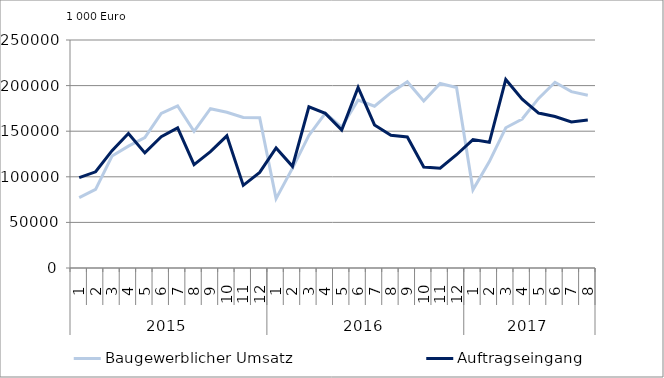
| Category | Baugewerblicher Umsatz | Auftragseingang |
|---|---|---|
| 0 | 77137.228 | 99023.008 |
| 1 | 86257.027 | 105491.844 |
| 2 | 122760.234 | 128704.324 |
| 3 | 133614.814 | 147438.665 |
| 4 | 142869.83 | 126182.175 |
| 5 | 169564.381 | 143879.815 |
| 6 | 177708.819 | 153660.001 |
| 7 | 149762.789 | 113338.261 |
| 8 | 174633.481 | 127520.775 |
| 9 | 170827.145 | 144931.886 |
| 10 | 165122.384 | 90621.16 |
| 11 | 164674.971 | 104795.622 |
| 12 | 76043.538 | 131571.482 |
| 13 | 109483.268 | 111467.248 |
| 14 | 145343.559 | 176673.268 |
| 15 | 169660.551 | 169566.96 |
| 16 | 154554.865 | 151228.165 |
| 17 | 184236.137 | 198035.655 |
| 18 | 177444.278 | 156900.898 |
| 19 | 192230.472 | 145537.167 |
| 20 | 204178.065 | 143616.217 |
| 21 | 183173.849 | 110770.94 |
| 22 | 202302.279 | 109384.188 |
| 23 | 197832.096 | 124193.91 |
| 24 | 85701.947 | 140751.008 |
| 25 | 116743.276 | 137863.383 |
| 26 | 153810.055 | 206710.579 |
| 27 | 163342.989 | 185183.797 |
| 28 | 185946.221 | 169878.51 |
| 29 | 203627.91 | 166148.392 |
| 30 | 193377.256 | 160134.206 |
| 31 | 189429.952 | 162221.206 |